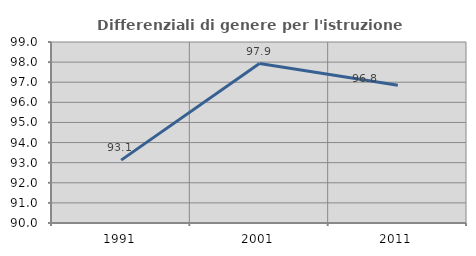
| Category | Differenziali di genere per l'istruzione superiore |
|---|---|
| 1991.0 | 93.126 |
| 2001.0 | 97.927 |
| 2011.0 | 96.845 |